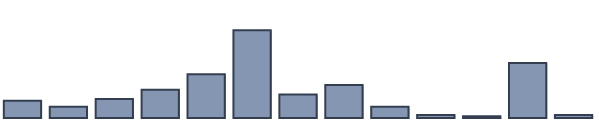
| Category | Series 0 |
|---|---|
| 0 | 5.1 |
| 1 | 3.3 |
| 2 | 5.6 |
| 3 | 8.4 |
| 4 | 13 |
| 5 | 26 |
| 6 | 7 |
| 7 | 9.8 |
| 8 | 3.3 |
| 9 | 0.9 |
| 10 | 0.5 |
| 11 | 16.3 |
| 12 | 0.9 |